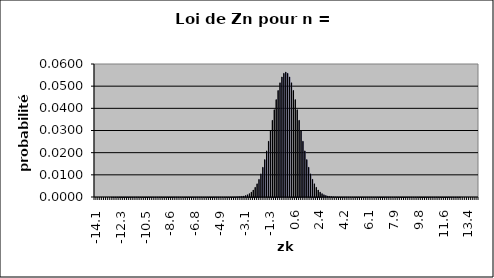
| Category | Series 0 |
|---|---|
| -14.14213562373095 | 0 |
| -14.00071426749364 | 0 |
| -13.85929291125633 | 0 |
| -13.717871555019022 | 0 |
| -13.576450198781712 | 0 |
| -13.435028842544403 | 0 |
| -13.293607486307092 | 0 |
| -13.152186130069783 | 0 |
| -13.010764773832474 | 0 |
| -12.869343417595164 | 0 |
| -12.727922061357855 | 0 |
| -12.586500705120546 | 0 |
| -12.445079348883237 | 0 |
| -12.303657992645926 | 0 |
| -12.162236636408617 | 0 |
| -12.020815280171307 | 0 |
| -11.879393923933998 | 0 |
| -11.737972567696689 | 0 |
| -11.59655121145938 | 0 |
| -11.455129855222069 | 0 |
| -11.31370849898476 | 0 |
| -11.17228714274745 | 0 |
| -11.030865786510141 | 0 |
| -10.889444430272832 | 0 |
| -10.748023074035522 | 0 |
| -10.606601717798213 | 0 |
| -10.465180361560902 | 0 |
| -10.323759005323593 | 0 |
| -10.182337649086284 | 0 |
| -10.040916292848975 | 0 |
| -9.899494936611665 | 0 |
| -9.758073580374356 | 0 |
| -9.616652224137045 | 0 |
| -9.475230867899736 | 0 |
| -9.333809511662427 | 0 |
| -9.192388155425117 | 0 |
| -9.050966799187808 | 0 |
| -8.909545442950499 | 0 |
| -8.76812408671319 | 0 |
| -8.626702730475879 | 0 |
| -8.48528137423857 | 0 |
| -8.34386001800126 | 0 |
| -8.202438661763951 | 0 |
| -8.061017305526642 | 0 |
| -7.919595949289332 | 0 |
| -7.7781745930520225 | 0 |
| -7.636753236814713 | 0 |
| -7.495331880577403 | 0 |
| -7.353910524340094 | 0 |
| -7.212489168102785 | 0 |
| -7.071067811865475 | 0 |
| -6.929646455628165 | 0 |
| -6.788225099390856 | 0 |
| -6.646803743153546 | 0 |
| -6.505382386916237 | 0 |
| -6.363961030678928 | 0 |
| -6.222539674441618 | 0 |
| -6.081118318204308 | 0 |
| -5.939696961966999 | 0 |
| -5.79827560572969 | 0 |
| -5.65685424949238 | 0 |
| -5.5154328932550705 | 0 |
| -5.374011537017761 | 0 |
| -5.232590180780451 | 0 |
| -5.091168824543142 | 0 |
| -4.949747468305833 | 0 |
| -4.808326112068523 | 0 |
| -4.666904755831213 | 0 |
| -4.525483399593904 | 0 |
| -4.384062043356595 | 0 |
| -4.242640687119285 | 0 |
| -4.1012193308819755 | 0 |
| -3.959797974644666 | 0 |
| -3.8183766184073566 | 0 |
| -3.676955262170047 | 0 |
| -3.5355339059327373 | 0 |
| -3.394112549695428 | 0 |
| -3.2526911934581184 | 0 |
| -3.111269837220809 | 0 |
| -2.9698484809834995 | 0.001 |
| -2.82842712474619 | 0.001 |
| -2.6870057685088806 | 0.002 |
| -2.545584412271571 | 0.002 |
| -2.4041630560342613 | 0.003 |
| -2.262741699796952 | 0.004 |
| -2.1213203435596424 | 0.006 |
| -1.979898987322333 | 0.008 |
| -1.8384776310850235 | 0.01 |
| -1.697056274847714 | 0.013 |
| -1.5556349186104046 | 0.017 |
| -1.414213562373095 | 0.021 |
| -1.2727922061357855 | 0.025 |
| -1.131370849898476 | 0.03 |
| -0.9899494936611665 | 0.035 |
| -0.848528137423857 | 0.039 |
| -0.7071067811865475 | 0.044 |
| -0.565685424949238 | 0.048 |
| -0.4242640687119285 | 0.052 |
| -0.282842712474619 | 0.054 |
| -0.1414213562373095 | 0.056 |
| 0.0 | 0.056 |
| 0.1414213562373095 | 0.056 |
| 0.282842712474619 | 0.054 |
| 0.4242640687119285 | 0.052 |
| 0.565685424949238 | 0.048 |
| 0.7071067811865475 | 0.044 |
| 0.848528137423857 | 0.039 |
| 0.9899494936611665 | 0.035 |
| 1.131370849898476 | 0.03 |
| 1.2727922061357855 | 0.025 |
| 1.414213562373095 | 0.021 |
| 1.5556349186104046 | 0.017 |
| 1.697056274847714 | 0.013 |
| 1.8384776310850235 | 0.01 |
| 1.979898987322333 | 0.008 |
| 2.1213203435596424 | 0.006 |
| 2.262741699796952 | 0.004 |
| 2.4041630560342613 | 0.003 |
| 2.545584412271571 | 0.002 |
| 2.6870057685088806 | 0.002 |
| 2.82842712474619 | 0.001 |
| 2.9698484809834995 | 0.001 |
| 3.111269837220809 | 0 |
| 3.2526911934581184 | 0 |
| 3.394112549695428 | 0 |
| 3.5355339059327373 | 0 |
| 3.676955262170047 | 0 |
| 3.8183766184073566 | 0 |
| 3.959797974644666 | 0 |
| 4.1012193308819755 | 0 |
| 4.242640687119285 | 0 |
| 4.384062043356595 | 0 |
| 4.525483399593904 | 0 |
| 4.666904755831213 | 0 |
| 4.808326112068523 | 0 |
| 4.949747468305833 | 0 |
| 5.091168824543142 | 0 |
| 5.232590180780451 | 0 |
| 5.374011537017761 | 0 |
| 5.5154328932550705 | 0 |
| 5.65685424949238 | 0 |
| 5.79827560572969 | 0 |
| 5.939696961966999 | 0 |
| 6.081118318204308 | 0 |
| 6.222539674441618 | 0 |
| 6.363961030678928 | 0 |
| 6.505382386916237 | 0 |
| 6.646803743153546 | 0 |
| 6.788225099390856 | 0 |
| 6.929646455628165 | 0 |
| 7.071067811865475 | 0 |
| 7.212489168102785 | 0 |
| 7.353910524340094 | 0 |
| 7.495331880577403 | 0 |
| 7.636753236814713 | 0 |
| 7.7781745930520225 | 0 |
| 7.919595949289332 | 0 |
| 8.061017305526642 | 0 |
| 8.202438661763951 | 0 |
| 8.34386001800126 | 0 |
| 8.48528137423857 | 0 |
| 8.626702730475879 | 0 |
| 8.76812408671319 | 0 |
| 8.909545442950499 | 0 |
| 9.050966799187808 | 0 |
| 9.192388155425117 | 0 |
| 9.333809511662427 | 0 |
| 9.475230867899736 | 0 |
| 9.616652224137045 | 0 |
| 9.758073580374356 | 0 |
| 9.899494936611665 | 0 |
| 10.040916292848975 | 0 |
| 10.182337649086284 | 0 |
| 10.323759005323593 | 0 |
| 10.465180361560902 | 0 |
| 10.606601717798213 | 0 |
| 10.748023074035522 | 0 |
| 10.889444430272832 | 0 |
| 11.030865786510141 | 0 |
| 11.17228714274745 | 0 |
| 11.31370849898476 | 0 |
| 11.455129855222069 | 0 |
| 11.59655121145938 | 0 |
| 11.737972567696689 | 0 |
| 11.879393923933998 | 0 |
| 12.020815280171307 | 0 |
| 12.162236636408617 | 0 |
| 12.303657992645926 | 0 |
| 12.445079348883237 | 0 |
| 12.586500705120546 | 0 |
| 12.727922061357855 | 0 |
| 12.869343417595164 | 0 |
| 13.010764773832474 | 0 |
| 13.152186130069783 | 0 |
| 13.293607486307092 | 0 |
| 13.435028842544403 | 0 |
| 13.576450198781712 | 0 |
| 13.717871555019022 | 0 |
| 13.85929291125633 | 0 |
| 14.00071426749364 | 0 |
| 14.14213562373095 | 0 |